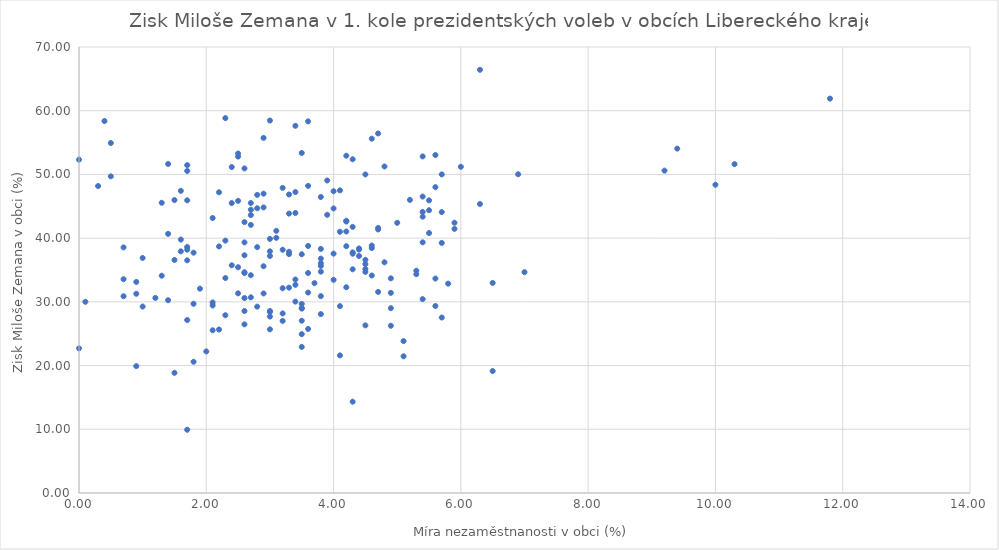
| Category | prez18_1k_zeman_proc |
|---|---|
| 5.5 | 44.38 |
| 3.3 | 37.5 |
| 4.0 | 47.36 |
| 0.7 | 38.55 |
| 1.4 | 51.64 |
| 10.0 | 48.38 |
| 4.5 | 35.16 |
| 3.4 | 43.95 |
| 2.6 | 42.52 |
| 5.4 | 39.34 |
| 5.2 | 46 |
| 0.5 | 54.93 |
| 2.7 | 43.62 |
| 3.9 | 49.05 |
| 1.3 | 34.1 |
| 1.3 | 45.55 |
| 2.1 | 43.16 |
| 2.9 | 46.98 |
| 2.9 | 44.82 |
| 2.4 | 51.16 |
| 3.5 | 22.93 |
| 2.5 | 53.28 |
| 2.6 | 50.94 |
| 5.9 | 41.46 |
| 3.3 | 46.85 |
| 1.7 | 51.46 |
| 0.5 | 49.7 |
| 3.2 | 38.18 |
| 1.5 | 45.98 |
| 4.3 | 52.38 |
| 2.1 | 29.43 |
| 0.4 | 58.38 |
| 3.0 | 28.57 |
| 4.0 | 44.66 |
| 1.4 | 40.67 |
| 5.6 | 29.35 |
| 2.3 | 58.84 |
| 2.7 | 42.08 |
| 5.7 | 50 |
| 4.5 | 35.92 |
| 4.6 | 34.14 |
| 1.7 | 38.19 |
| 1.6 | 47.42 |
| 2.8 | 44.69 |
| 2.7 | 45.52 |
| 2.3 | 27.9 |
| 2.5 | 35.44 |
| 9.4 | 54.05 |
| 10.3 | 51.61 |
| 0.0 | 52.32 |
| 1.6 | 39.78 |
| 2.2 | 47.2 |
| 4.2 | 52.94 |
| 1.7 | 38.61 |
| 1.7 | 50.55 |
| 3.6 | 48.2 |
| 11.8 | 61.9 |
| 1.8 | 20.6 |
| 1.7 | 9.93 |
| 5.4 | 30.43 |
| 5.9 | 42.42 |
| 2.2 | 38.7 |
| 0.9 | 31.27 |
| 3.4 | 33.51 |
| 3.0 | 25.69 |
| 0.1 | 30.01 |
| 4.5 | 50 |
| 4.2 | 42.73 |
| 4.7 | 31.56 |
| 3.5 | 28.94 |
| 4.9 | 26.25 |
| 2.6 | 39.33 |
| 3.6 | 31.46 |
| 2.6 | 30.6 |
| 2.1 | 25.54 |
| 2.3 | 33.74 |
| 2.6 | 34.65 |
| 2.6 | 34.52 |
| 3.0 | 39.88 |
| 2.1 | 29.91 |
| 3.4 | 32.67 |
| 2.2 | 25.66 |
| 2.5 | 31.34 |
| 1.7 | 36.52 |
| 4.3 | 35.11 |
| 5.5 | 45.93 |
| 4.3 | 41.77 |
| 2.5 | 52.8 |
| 1.8 | 29.7 |
| 2.3 | 39.61 |
| 3.8 | 36.07 |
| 4.6 | 38.84 |
| 2.5 | 45.85 |
| 2.4 | 45.51 |
| 9.2 | 50.6 |
| 2.9 | 35.59 |
| 6.3 | 66.42 |
| 4.3 | 37.77 |
| 1.9 | 32.07 |
| 2.7 | 44.46 |
| 4.2 | 41.04 |
| 4.8 | 51.25 |
| 3.0 | 37.93 |
| 4.7 | 56.43 |
| 5.0 | 42.41 |
| 2.9 | 55.74 |
| 4.2 | 38.74 |
| 5.6 | 48 |
| 4.7 | 41.6 |
| 2.8 | 38.59 |
| 3.8 | 46.46 |
| 3.2 | 47.89 |
| 4.2 | 42.6 |
| 3.0 | 58.46 |
| 4.9 | 33.69 |
| 3.3 | 32.23 |
| 6.0 | 51.2 |
| 3.4 | 47.23 |
| 3.6 | 58.33 |
| 2.6 | 28.57 |
| 4.6 | 38.44 |
| 4.6 | 55.61 |
| 5.5 | 40.8 |
| 0.7 | 30.88 |
| 4.2 | 32.29 |
| 3.7 | 32.94 |
| 6.3 | 45.36 |
| 6.9 | 50.03 |
| 3.6 | 34.53 |
| 3.8 | 38.31 |
| 1.0 | 36.89 |
| 1.2 | 30.62 |
| 5.6 | 53.04 |
| 5.8 | 32.86 |
| 0.3 | 48.18 |
| 0.0 | 22.7 |
| 5.4 | 46.53 |
| 4.7 | 41.36 |
| 1.0 | 29.26 |
| 2.7 | 30.71 |
| 3.0 | 28.41 |
| 2.4 | 35.74 |
| 0.9 | 33.13 |
| 1.5 | 18.86 |
| 3.2 | 27.01 |
| 3.4 | 57.63 |
| 2.6 | 37.31 |
| 5.4 | 44.11 |
| 5.7 | 39.25 |
| 2.0 | 22.22 |
| 1.8 | 37.72 |
| 5.1 | 21.45 |
| 4.5 | 36.59 |
| 4.0 | 37.57 |
| 0.7 | 33.56 |
| 3.2 | 32.14 |
| 4.1 | 29.33 |
| 3.8 | 35.64 |
| 3.6 | 25.75 |
| 6.5 | 32.97 |
| 0.9 | 19.91 |
| 5.4 | 52.83 |
| 3.9 | 43.66 |
| 3.5 | 24.93 |
| 3.8 | 34.74 |
| 5.3 | 34.34 |
| 2.8 | 46.79 |
| 6.5 | 19.14 |
| 3.8 | 30.9 |
| 1.5 | 36.58 |
| 3.5 | 37.47 |
| 4.4 | 38.21 |
| 3.3 | 37.86 |
| 4.1 | 41 |
| 5.7 | 44.09 |
| 3.8 | 36.79 |
| 4.9 | 31.41 |
| 3.5 | 29.68 |
| 5.3 | 34.88 |
| 3.5 | 27.04 |
| 3.4 | 30.04 |
| 2.8 | 29.25 |
| 4.8 | 36.21 |
| 2.9 | 31.32 |
| 4.9 | 29.01 |
| 2.7 | 34.18 |
| 4.1 | 21.6 |
| 5.1 | 23.84 |
| 5.4 | 43.37 |
| 1.7 | 27.15 |
| 3.5 | 53.37 |
| 3.2 | 28.18 |
| 1.6 | 37.93 |
| 4.5 | 26.31 |
| 5.7 | 27.54 |
| 4.4 | 37.2 |
| 3.8 | 28.08 |
| 1.4 | 30.26 |
| 4.4 | 38.38 |
| 4.1 | 47.5 |
| 3.1 | 40.05 |
| 2.6 | 26.47 |
| 1.7 | 45.94 |
| 3.0 | 27.69 |
| 3.1 | 41.15 |
| 7.0 | 34.66 |
| 3.5 | 29.04 |
| 3.3 | 43.85 |
| 5.6 | 33.66 |
| 4.3 | 14.33 |
| 4.3 | 37.56 |
| 4.0 | 33.46 |
| 4.5 | 34.7 |
| 3.6 | 38.77 |
| 3.0 | 37.2 |